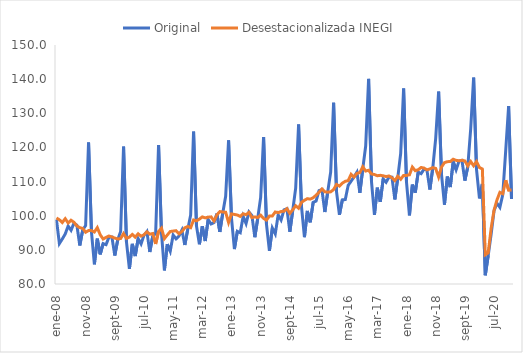
| Category | Original | Desestacionalizada INEGI |
|---|---|---|
| 2008-01-01 | 98.866 | 99.344 |
| 2008-02-01 | 91.845 | 98.815 |
| 2008-03-01 | 93.189 | 97.997 |
| 2008-04-01 | 94.632 | 99.13 |
| 2008-05-01 | 96.978 | 97.872 |
| 2008-06-01 | 95.732 | 98.673 |
| 2008-07-01 | 97.799 | 98.082 |
| 2008-08-01 | 97.212 | 97.005 |
| 2008-09-01 | 91.285 | 96.501 |
| 2008-10-01 | 95.806 | 96.281 |
| 2008-11-01 | 97.131 | 95.153 |
| 2008-12-01 | 121.45 | 95.66 |
| 2009-01-01 | 95.276 | 95.652 |
| 2009-02-01 | 85.776 | 95.223 |
| 2009-03-01 | 93.28 | 96.513 |
| 2009-04-01 | 88.678 | 94.425 |
| 2009-05-01 | 91.826 | 93.177 |
| 2009-06-01 | 91.529 | 93.648 |
| 2009-07-01 | 93.734 | 94.06 |
| 2009-08-01 | 93.778 | 93.769 |
| 2009-09-01 | 88.341 | 93.454 |
| 2009-10-01 | 92.941 | 93.19 |
| 2009-11-01 | 95.372 | 93.321 |
| 2009-12-01 | 120.247 | 94.766 |
| 2010-01-01 | 92.32 | 93.36 |
| 2010-02-01 | 84.42 | 93.736 |
| 2010-03-01 | 91.762 | 94.522 |
| 2010-04-01 | 88.178 | 93.725 |
| 2010-05-01 | 93.303 | 94.7 |
| 2010-06-01 | 91.747 | 94.005 |
| 2010-07-01 | 94.264 | 94.41 |
| 2010-08-01 | 95.339 | 95.273 |
| 2010-09-01 | 89.376 | 94.59 |
| 2010-10-01 | 94.015 | 94.781 |
| 2010-11-01 | 94.801 | 91.728 |
| 2010-12-01 | 120.698 | 95.386 |
| 2011-01-01 | 94.918 | 96.341 |
| 2011-02-01 | 83.987 | 93.297 |
| 2011-03-01 | 91.666 | 94.353 |
| 2011-04-01 | 89.605 | 95.371 |
| 2011-05-01 | 94.353 | 95.504 |
| 2011-06-01 | 93.231 | 95.616 |
| 2011-07-01 | 94.074 | 94.704 |
| 2011-08-01 | 95.789 | 95.388 |
| 2011-09-01 | 91.436 | 96.456 |
| 2011-10-01 | 95.961 | 96.851 |
| 2011-11-01 | 100.165 | 96.492 |
| 2011-12-01 | 124.623 | 98.751 |
| 2012-01-01 | 97.006 | 98.508 |
| 2012-02-01 | 91.631 | 99.003 |
| 2012-03-01 | 96.93 | 99.652 |
| 2012-04-01 | 92.591 | 99.37 |
| 2012-05-01 | 98.884 | 99.575 |
| 2012-06-01 | 97.579 | 99.663 |
| 2012-07-01 | 97.976 | 98.47 |
| 2012-08-01 | 100.634 | 100.238 |
| 2012-09-01 | 95.261 | 101.21 |
| 2012-10-01 | 100.738 | 101.086 |
| 2012-11-01 | 105.68 | 101.013 |
| 2012-12-01 | 122.082 | 97.995 |
| 2013-01-01 | 99.32 | 100.53 |
| 2013-02-01 | 90.235 | 100.375 |
| 2013-03-01 | 95.429 | 100.2 |
| 2013-04-01 | 95.022 | 99.792 |
| 2013-05-01 | 99.806 | 100.571 |
| 2013-06-01 | 97.695 | 100.301 |
| 2013-07-01 | 101.068 | 100.973 |
| 2013-08-01 | 100.029 | 99.449 |
| 2013-09-01 | 93.71 | 99.648 |
| 2013-10-01 | 99.24 | 99.468 |
| 2013-11-01 | 105.378 | 100.155 |
| 2013-12-01 | 123.068 | 99.207 |
| 2014-01-01 | 97.427 | 98.715 |
| 2014-02-01 | 89.714 | 99.907 |
| 2014-03-01 | 96.392 | 99.929 |
| 2014-04-01 | 94.683 | 101.099 |
| 2014-05-01 | 100.238 | 100.898 |
| 2014-06-01 | 98.75 | 101.231 |
| 2014-07-01 | 101.712 | 101.328 |
| 2014-08-01 | 102.042 | 102.054 |
| 2014-09-01 | 95.303 | 100.693 |
| 2014-10-01 | 101.569 | 101.732 |
| 2014-11-01 | 108.059 | 102.918 |
| 2014-12-01 | 126.707 | 102.197 |
| 2015-01-01 | 102.635 | 103.91 |
| 2015-02-01 | 93.71 | 104.518 |
| 2015-03-01 | 101.403 | 104.992 |
| 2015-04-01 | 98.067 | 104.862 |
| 2015-05-01 | 103.919 | 105.271 |
| 2015-06-01 | 104.293 | 105.99 |
| 2015-07-01 | 107.342 | 106.848 |
| 2015-08-01 | 107.646 | 107.819 |
| 2015-09-01 | 101.08 | 107.004 |
| 2015-10-01 | 107.045 | 106.898 |
| 2015-11-01 | 112.803 | 106.993 |
| 2015-12-01 | 133.104 | 107.657 |
| 2016-01-01 | 107.03 | 109.154 |
| 2016-02-01 | 100.26 | 108.68 |
| 2016-03-01 | 104.644 | 109.532 |
| 2016-04-01 | 104.733 | 110.084 |
| 2016-05-01 | 108.885 | 110.275 |
| 2016-06-01 | 110.12 | 112.122 |
| 2016-07-01 | 111.36 | 111.31 |
| 2016-08-01 | 112.742 | 112.407 |
| 2016-09-01 | 106.705 | 112.645 |
| 2016-10-01 | 113.718 | 114.343 |
| 2016-11-01 | 120.404 | 113.092 |
| 2016-12-01 | 140.083 | 113.314 |
| 2017-01-01 | 109.896 | 112.232 |
| 2017-02-01 | 100.245 | 112.068 |
| 2017-03-01 | 108.211 | 111.712 |
| 2017-04-01 | 104.05 | 111.826 |
| 2017-05-01 | 110.791 | 111.687 |
| 2017-06-01 | 109.806 | 111.466 |
| 2017-07-01 | 111.354 | 111.646 |
| 2017-08-01 | 111.295 | 111.103 |
| 2017-09-01 | 104.769 | 110.29 |
| 2017-10-01 | 111.103 | 111.541 |
| 2017-11-01 | 118.261 | 110.681 |
| 2017-12-01 | 137.265 | 111.807 |
| 2018-01-01 | 109.745 | 111.813 |
| 2018-02-01 | 100.093 | 111.972 |
| 2018-03-01 | 109.111 | 114.248 |
| 2018-04-01 | 106.743 | 113.187 |
| 2018-05-01 | 112.744 | 113.467 |
| 2018-06-01 | 112.315 | 114.131 |
| 2018-07-01 | 113.64 | 113.952 |
| 2018-08-01 | 113.369 | 113.441 |
| 2018-09-01 | 107.673 | 113.693 |
| 2018-10-01 | 113.974 | 114.084 |
| 2018-11-01 | 122.674 | 113.844 |
| 2018-12-01 | 136.356 | 111.333 |
| 2019-01-01 | 112.044 | 114.255 |
| 2019-02-01 | 103.226 | 115.537 |
| 2019-03-01 | 111.457 | 115.829 |
| 2019-04-01 | 108.39 | 115.873 |
| 2019-05-01 | 115.875 | 116.538 |
| 2019-06-01 | 113.452 | 116.211 |
| 2019-07-01 | 116.021 | 116.083 |
| 2019-08-01 | 116.178 | 116.247 |
| 2019-09-01 | 110.286 | 116.033 |
| 2019-10-01 | 114.357 | 114.578 |
| 2019-11-01 | 125.47 | 115.874 |
| 2019-12-01 | 140.451 | 114.643 |
| 2020-01-01 | 113.485 | 115.861 |
| 2020-02-01 | 105.073 | 114.121 |
| 2020-03-01 | 109.275 | 113.672 |
| 2020-04-01 | 82.558 | 88.568 |
| 2020-05-01 | 88.321 | 89.137 |
| 2020-06-01 | 94.531 | 96.263 |
| 2020-07-01 | 101.439 | 101.6 |
| 2020-08-01 | 103.669 | 104.602 |
| 2020-09-01 | 102.464 | 106.844 |
| 2020-10-01 | 106.225 | 106.454 |
| 2020-11-01 | 119.087 | 110.395 |
| 2020-12-01 | 132.106 | 107.469 |
| 2021-01-01 | 104.898 | 107.549 |